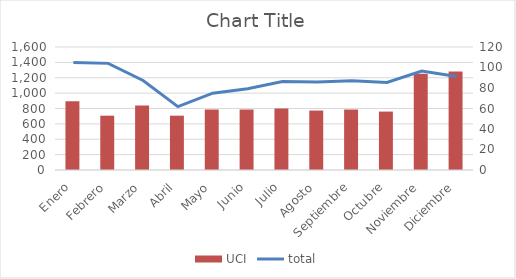
| Category | UCI |
|---|---|
| Enero | 67 |
| Febrero | 53 |
| Marzo | 63 |
| Abril | 53 |
| Mayo | 59 |
| Junio | 59 |
| Julio | 60 |
| Agosto | 58 |
| Septiembre | 59 |
| Octubre | 57 |
| Noviembre | 94 |
| Diciembre | 96 |